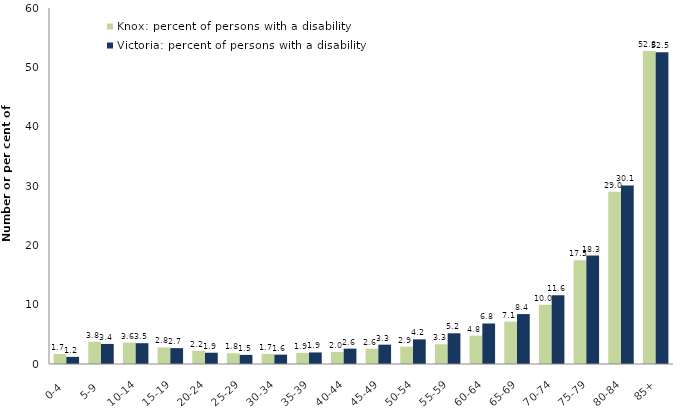
| Category | Knox: percent of persons with a disability | Victoria: percent of persons with a disability |
|---|---|---|
| 0-4 | 1.681 | 1.2 |
| 5-9 | 3.758 | 3.383 |
| 10-14 | 3.605 | 3.504 |
| 15-19 | 2.792 | 2.675 |
| 20-24 | 2.207 | 1.899 |
| 25-29 | 1.808 | 1.534 |
| 30-34 | 1.7 | 1.578 |
| 35-39 | 1.877 | 1.947 |
| 40-44 | 2.026 | 2.588 |
| 45-49 | 2.577 | 3.259 |
| 50-54 | 2.923 | 4.152 |
| 55-59 | 3.326 | 5.175 |
| 60-64 | 4.776 | 6.827 |
| 65-69 | 7.133 | 8.414 |
| 70-74 | 9.977 | 11.585 |
| 75-79 | 17.465 | 18.273 |
| 80-84 | 29.012 | 30.094 |
| 85+ | 52.756 | 52.533 |